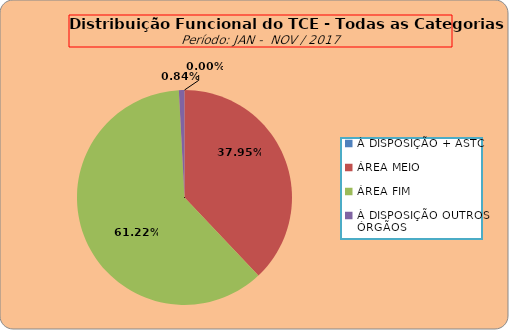
| Category | Series 0 |
|---|---|
| À DISPOSIÇÃO + ASTC | 0 |
| ÁREA MEIO | 181 |
| ÁREA FIM | 292 |
| À DISPOSIÇÃO OUTROS ÓRGÃOS | 4 |